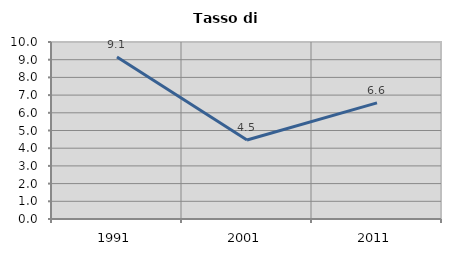
| Category | Tasso di disoccupazione   |
|---|---|
| 1991.0 | 9.146 |
| 2001.0 | 4.46 |
| 2011.0 | 6.559 |